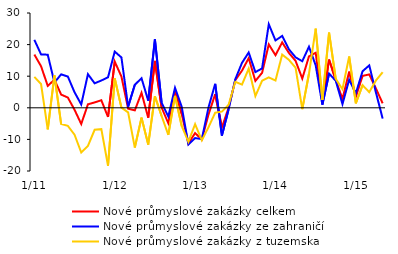
| Category | Nové průmyslové zakázky celkem | Nové průmyslové zakázky ze zahraničí  | Nové průmyslové zakázky z tuzemska |
|---|---|---|---|
|  1/11 | 16.85 | 21.514 | 9.807 |
| 2 | 13.154 | 16.901 | 7.528 |
| 3 | 6.938 | 16.802 | -6.819 |
| 4 | 8.892 | 7.984 | 10.239 |
| 5 | 4.188 | 10.586 | -5.137 |
| 6 | 3.246 | 9.886 | -5.724 |
| 7 | -0.623 | 4.925 | -8.5 |
| 8 | -5.126 | 1.058 | -14.145 |
| 9 | 1.1 | 10.634 | -12.039 |
| 10 | 1.704 | 7.748 | -6.953 |
| 11 | 2.394 | 8.637 | -6.752 |
| 12 | -2.894 | 9.651 | -18.333 |
|  1/12 | 14.624 | 17.793 | 9.33 |
| 2 | 9.896 | 15.93 | 0.05 |
| 3 | -0.281 | 0.391 | -1.457 |
| 4 | -0.814 | 7.288 | -12.59 |
| 5 | 4.741 | 9.357 | -3.102 |
| 6 | -3.143 | 2.261 | -11.653 |
| 7 | 14.815 | 21.663 | 3.666 |
| 8 | 0.079 | 1.643 | -2.606 |
| 9 | -4.895 | -2.779 | -8.562 |
| 10 | 5.379 | 6.356 | 3.757 |
| 11 | -1.932 | 0.32 | -5.774 |
| 12 | -11.272 | -11.592 | -10.744 |
|  1/13 | -7.998 | -9.564 | -5.178 |
| 2 | -10.043 | -9.916 | -10.282 |
| 3 | -2.123 | 0.136 | -6.148 |
| 4 | 4.313 | 7.599 | -1.549 |
| 5 | -6.195 | -8.805 | -1.189 |
| 6 | 0.019 | -0.489 | 0.944 |
| 7 | 8.758 | 9.042 | 8.215 |
| 8 | 11.759 | 14.22 | 7.351 |
| 9 | 15.703 | 17.505 | 12.38 |
| 10 | 8.495 | 11.308 | 3.714 |
| 11 | 11.071 | 12.451 | 8.563 |
| 12 | 20.066 | 26.446 | 9.623 |
|  1/14 | 16.65 | 21.317 | 8.636 |
| 2 | 20.7 | 22.734 | 16.838 |
| 3 | 17.373 | 18.524 | 15.183 |
| 4 | 14.857 | 15.971 | 12.685 |
| 5 | 9.263 | 14.744 | -0.437 |
| 6 | 16.27 | 19.328 | 10.776 |
| 7 | 17.423 | 13.455 | 25.062 |
| 8 | 1.496 | 0.97 | 2.498 |
| 9 | 15.254 | 10.831 | 23.777 |
| 10 | 8.78 | 8.559 | 9.184 |
| 11 | 2.802 | 1.167 | 5.878 |
| 12 | 11.436 | 8.896 | 16.231 |
|  1/15 | 3.519 | 4.614 | 1.42 |
| 2 | 10.09 | 11.56 | 7.158 |
| 3 | 10.559 | 13.422 | 4.96 |
| 4 | 6.091 | 4.811 | 8.658 |
| 5 | 1.418 | -3.406 | 11.257 |